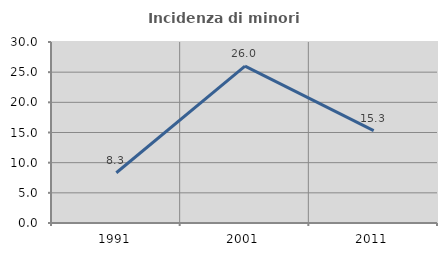
| Category | Incidenza di minori stranieri |
|---|---|
| 1991.0 | 8.333 |
| 2001.0 | 26 |
| 2011.0 | 15.315 |